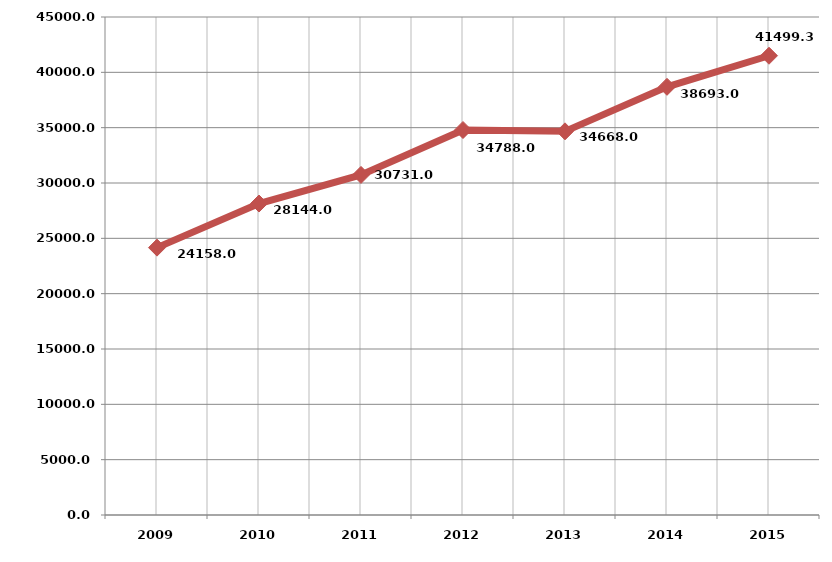
| Category | الطاقة المولــــدة
 [جبجا واط . ساعة) Generation (GWH) |
|---|---|
| 2009.0 | 24158 |
| 2010.0 | 28144 |
| 2011.0 | 30731 |
| 2012.0 | 34788 |
| 2013.0 | 34668 |
| 2014.0 | 38693 |
| 2015.0 | 41499.3 |